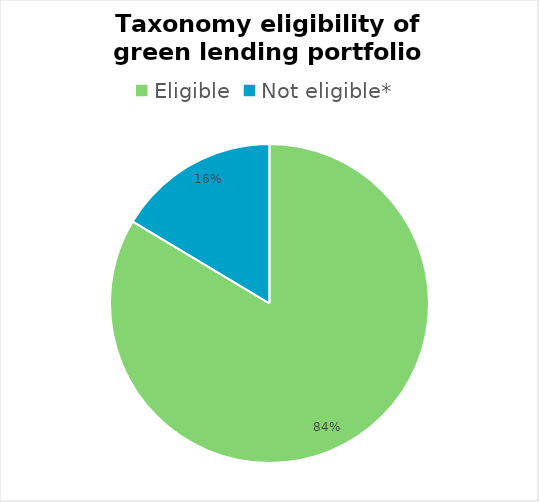
| Category | Series 0 |
|---|---|
| Eligible  | 0.836 |
| Not eligible* | 0.164 |